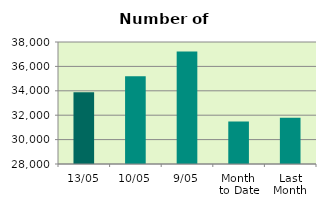
| Category | Series 0 |
|---|---|
| 13/05 | 33874 |
| 10/05 | 35196 |
| 9/05 | 37228 |
| Month 
to Date | 31493.25 |
| Last
Month | 31788.9 |